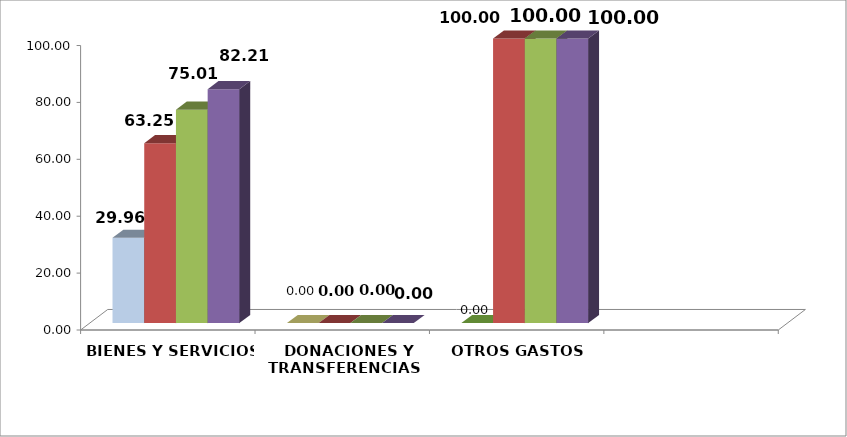
| Category | 1er Trimestre | 2do Trimestre | 3er Trimestre | 4to Trimestre |
|---|---|---|---|---|
|  BIENES Y SERVICIOS | 29.964 | 63.246 | 75.008 | 82.208 |
|   DONACIONES Y TRANSFERENCIAS | 0 | 0 | 0 | 0 |
|  OTROS GASTOS | 0 | 100 | 100 | 100 |